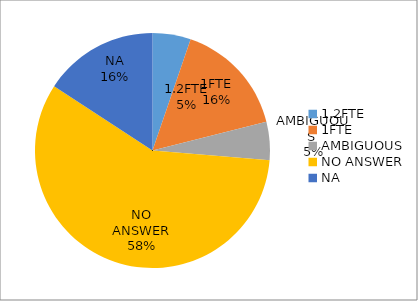
| Category | Series 0 |
|---|---|
| 1.2FTE | 0.053 |
| 1FTE | 0.158 |
| AMBIGUOUS  | 0.053 |
| NO ANSWER | 0.579 |
| NA | 0.158 |